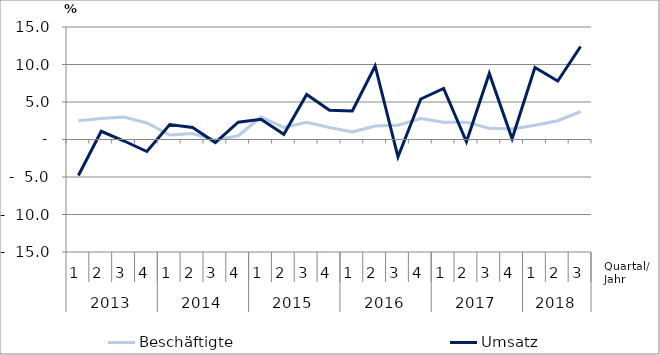
| Category | Beschäftigte | Umsatz |
|---|---|---|
| 0 | 2.5 | -4.8 |
| 1 | 2.8 | 1.1 |
| 2 | 3 | -0.2 |
| 3 | 2.2 | -1.6 |
| 4 | 0.6 | 2 |
| 5 | 0.8 | 1.6 |
| 6 | -0.1 | -0.4 |
| 7 | 0.5 | 2.3 |
| 8 | 3 | 2.7 |
| 9 | 1.6 | 0.7 |
| 10 | 2.3 | 6 |
| 11 | 1.6 | 3.9 |
| 12 | 1 | 3.8 |
| 13 | 1.8 | 9.8 |
| 14 | 1.9 | -2.3 |
| 15 | 2.8 | 5.4 |
| 16 | 2.3 | 6.8 |
| 17 | 2.3 | -0.3 |
| 18 | 1.5 | 8.8 |
| 19 | 1.4 | 0.1 |
| 20 | 1.9 | 9.6 |
| 21 | 2.5 | 7.8 |
| 22 | 3.7 | 12.4 |